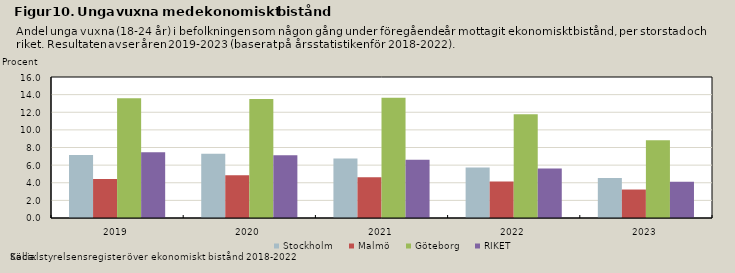
| Category | Stockholm | Malmö | Göteborg | RIKET |
|---|---|---|---|---|
| 2019.0 | 7.157 | 4.428 | 13.595 | 7.461 |
| 2020.0 | 7.304 | 4.852 | 13.502 | 7.123 |
| 2021.0 | 6.765 | 4.618 | 13.646 | 6.621 |
| 2022.0 | 5.722 | 4.145 | 11.78 | 5.622 |
| 2023.0 | 4.549 | 3.231 | 8.812 | 4.114 |